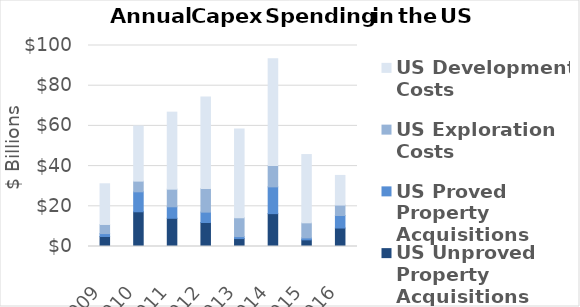
| Category | US Unproved Property Acquisitions | US Proved Property Acquisitions | US Exploration Costs | US Development Costs |
|---|---|---|---|---|
| 2009 | 4975.149 | 1447.444 | 4539.46 | 20228.867 |
| 2010 | 17275.621 | 9931.554 | 5320.503 | 27422.859 |
| 2011 | 14036.453 | 5725.774 | 8761.617 | 38310.554 |
| 2012 | 11950.448 | 5150.928 | 11753.658 | 45534.379 |
| 2013 | 3942.213 | 986.756 | 9426.509 | 44088.647 |
| 2014 | 16351.496 | 13319.788 | 10610.537 | 53171.304 |
| 2015 | 3305.629 | 977.676 | 7500.718 | 33956.074 |
| 2016 | 9189.828 | 6234.886 | 5193.528 | 14739.115 |